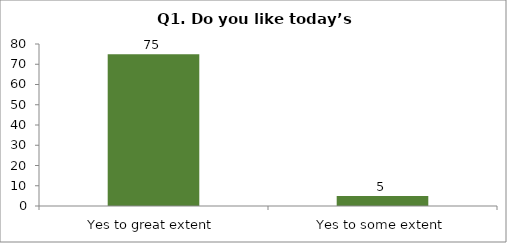
| Category | Q1. Do you like today’s session? |
|---|---|
| Yes to great extent | 75 |
| Yes to some extent | 5 |